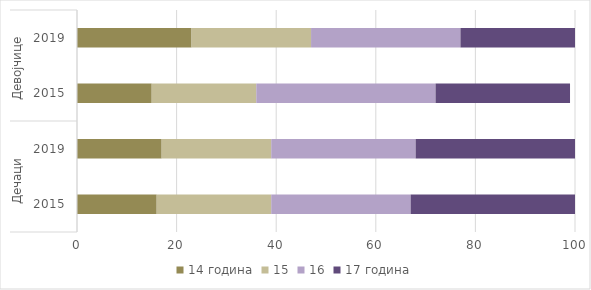
| Category | 14 година | 15 | 16 | 17 година |
|---|---|---|---|---|
| 0 | 16 | 23 | 28 | 33 |
| 1 | 17 | 22 | 29 | 32 |
| 2 | 15 | 21 | 36 | 27 |
| 3 | 23 | 24 | 30 | 23 |